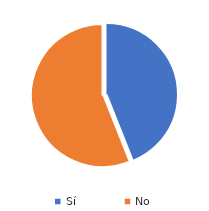
| Category | Series 0 |
|---|---|
| Sí | 44 |
| No | 56 |